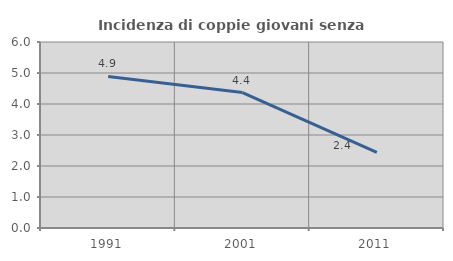
| Category | Incidenza di coppie giovani senza figli |
|---|---|
| 1991.0 | 4.887 |
| 2001.0 | 4.368 |
| 2011.0 | 2.439 |